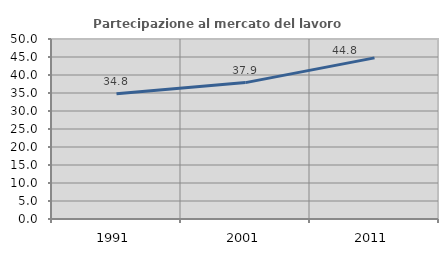
| Category | Partecipazione al mercato del lavoro  femminile |
|---|---|
| 1991.0 | 34.765 |
| 2001.0 | 37.887 |
| 2011.0 | 44.762 |